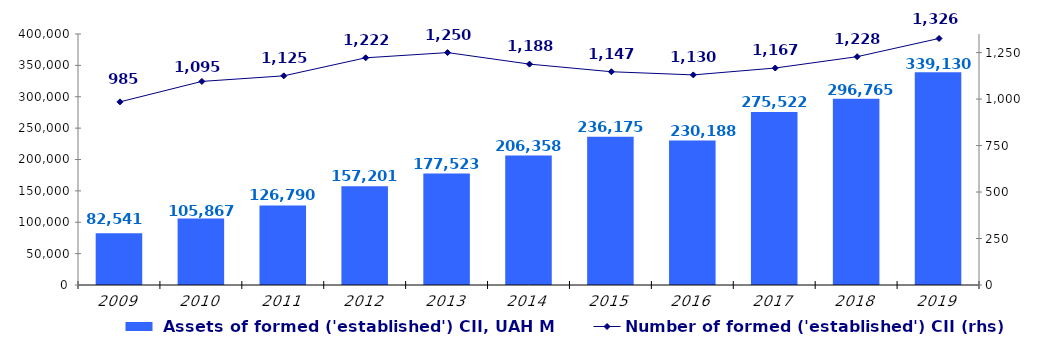
| Category |  Assets of formed ('established') CII, UAH M |
|---|---|
| 2009 | 82540.927 |
| 2010 | 105866.588 |
| 2011 | 126789.599 |
| 2012 | 157201.12 |
| 2013 | 177522.991 |
| 2014 | 206358.013 |
| 2015 | 236175 |
| 2016 | 230188.003 |
| 2017 | 275522.311 |
| 2018 | 296765.381 |
| 2019 | 339129.8 |